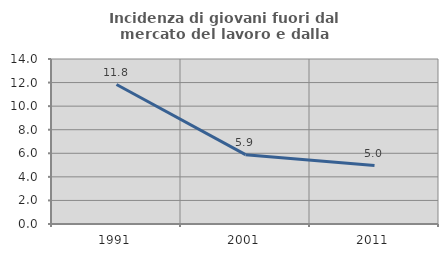
| Category | Incidenza di giovani fuori dal mercato del lavoro e dalla formazione  |
|---|---|
| 1991.0 | 11.834 |
| 2001.0 | 5.882 |
| 2011.0 | 4.959 |